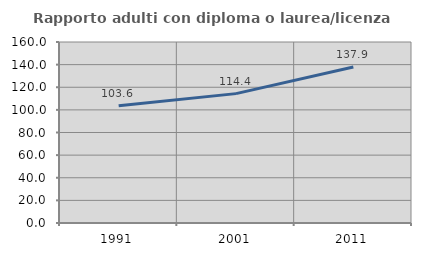
| Category | Rapporto adulti con diploma o laurea/licenza media  |
|---|---|
| 1991.0 | 103.634 |
| 2001.0 | 114.37 |
| 2011.0 | 137.904 |